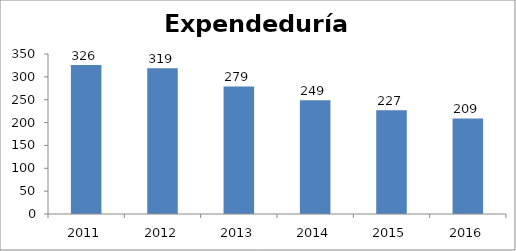
| Category | EXpendedurías |
|---|---|
| 2011.0 | 326 |
| 2012.0 | 319 |
| 2013.0 | 279 |
| 2014.0 | 249 |
| 2015.0 | 227 |
| 2016.0 | 209 |